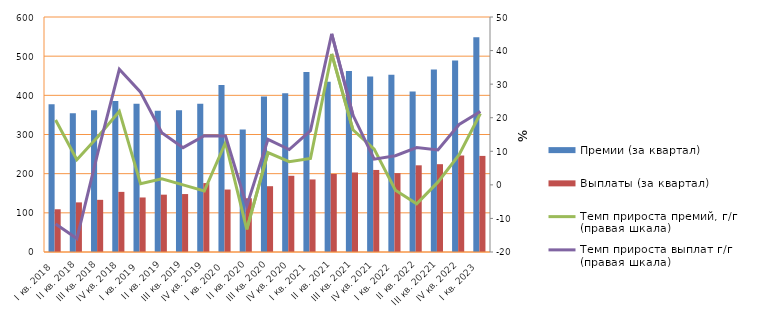
| Category | Премии (за квартал) | Выплаты (за квартал)  |
|---|---|---|
| I кв. 2018 | 377414.267 | 109098.901 |
| II кв. 2018 | 354367.676 | 126682.082 |
| III кв. 2018 | 362054.213 | 133194.126 |
| IV кв. 2018 | 385664.971 | 153492.903 |
| I кв. 2019 | 378595.415 | 139216.124 |
| II кв. 2019 | 360653.097 | 146377.836 |
| III кв. 2019 | 362088.161 | 147946.617 |
| IV кв. 2019 | 378630.365 | 175983.332 |
| I кв. 2020 | 426272.4 | 159473.6 |
| II кв. 2020 | 312775.21 | 137211.863 |
| III кв. 2020 | 396828.975 | 167988.017 |
| IV кв. 2020 | 405055.315 | 194574.784 |
| I кв. 2021 | 459799.28 | 185252.354 |
| II кв. 2021 | 434384.194 | 199237.794 |
| III кв. 2021 | 461943.852 | 203008.653 |
| IV кв. 2021 | 448133.957 | 209475.051 |
| I кв. 2022 | 452281.342 | 201348.371 |
| II кв. 2022 | 409975.844 | 221333.097 |
| III кв. 20221 | 465677.529 | 224211.436 |
| IV кв. 2022 | 488812.926 | 246325.877 |
| I кв. 2023 | 548353.864 | 245352.891 |